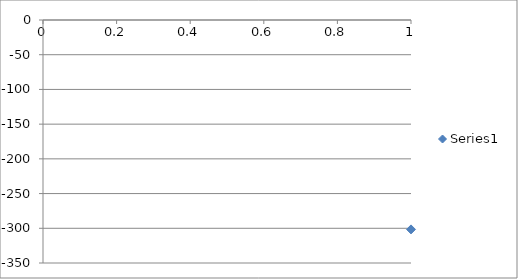
| Category | Series 0 |
|---|---|
| 0 | -301.6 |
| 1 | -287.65 |
| 2 | -273.39 |
| 3 | -258.89 |
| 4 | -244.34 |
| 5 | -229.67 |
| 6 | -214.93 |
| 7 | -200.11 |
| 8 | -185.19 |
| 9 | -170.23 |
| 10 | -155.26 |
| 11 | -140.24 |
| 12 | -125.19 |
| 13 | -110.05 |
| 14 | -94.94 |
| 15 | -79.78 |
| 16 | -64.58 |
| 17 | -49.35 |
| 18 | -34.18 |
| 19 | -18.94 |
| 20 | -3.71 |